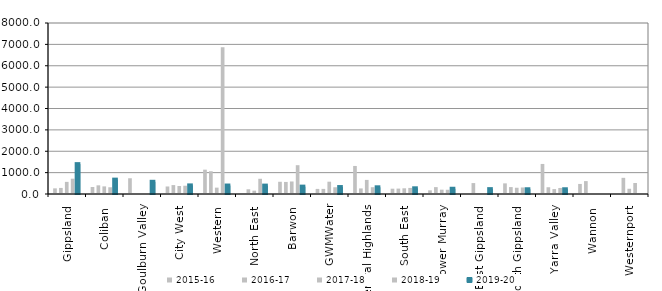
| Category | 2015-16 | 2016-17 | 2017-18 | 2018-19 | 2019-20 |
|---|---|---|---|---|---|
| Gippsland  | 264.537 | 284.062 | 566.913 | 716.228 | 1397.562 |
| Coliban  | 328.692 | 405.348 | 356.278 | 314.824 | 672.278 |
| Goulburn Valley  | 736.5 | 0 | 0 | 0 | 571 |
| City West  | 351.97 | 417.408 | 374.669 | 386.487 | 402.051 |
| Western  | 1138 | 1065 | 297.8 | 6869.4 | 396.6 |
| North East  | 0 | 221.167 | 155.5 | 712 | 392.5 |
| Barwon  | 571.5 | 564.304 | 585.6 | 1347.945 | 345.083 |
| GWMWater | 237.95 | 239.069 | 575.059 | 315.294 | 324.871 |
| Central Highlands  | 1311.714 | 260.787 | 659.531 | 318.077 | 313.271 |
| South East  | 247.884 | 253.158 | 266.076 | 284.41 | 266.36 |
| Lower Murray  | 171.5 | 321.833 | 201.727 | 198.3 | 245.333 |
| East Gippsland  | 0 | 511 | 0 | 0 | 227.667 |
| South Gippsland  | 497.527 | 323.349 | 291.943 | 305.667 | 221.684 |
| Yarra Valley  | 1405.444 | 315.928 | 229.907 | 282.741 | 221.621 |
| Wannon  | 470 | 603.254 | 0 | 0 | 0 |
| Westernport  | 0 | 756.55 | 245.017 | 514 | 0 |